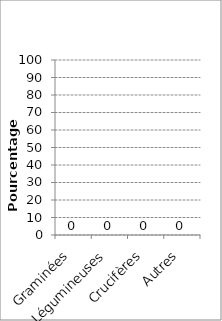
| Category | % |
|---|---|
| Graminées | 0 |
| Légumineuses | 0 |
| Crucifères | 0 |
| Autres | 0 |